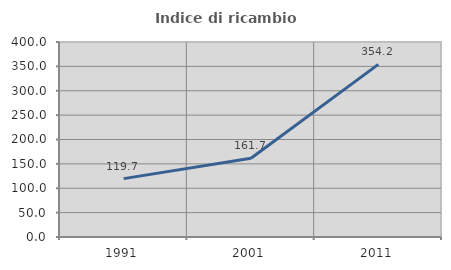
| Category | Indice di ricambio occupazionale  |
|---|---|
| 1991.0 | 119.708 |
| 2001.0 | 161.667 |
| 2011.0 | 354.167 |